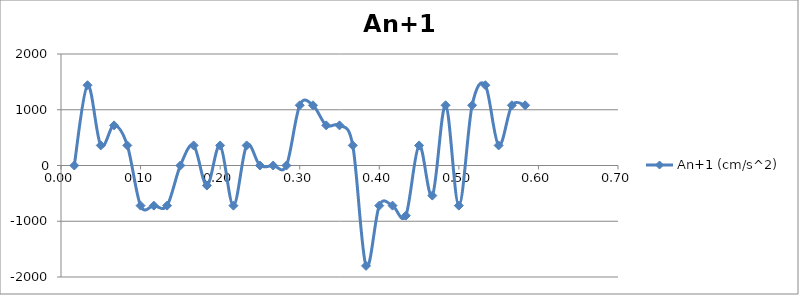
| Category | An+1 (cm/s^2) |
|---|---|
| 0.0166666666666667 | 0 |
| 0.0333333333333333 | 1440 |
| 0.05 | 360 |
| 0.0666666666666667 | 720 |
| 0.0833333333333333 | 360 |
| 0.1 | -720 |
| 0.116666666666667 | -720 |
| 0.133333333333333 | -720 |
| 0.15 | 0 |
| 0.166666666666667 | 360 |
| 0.183333333333333 | -360 |
| 0.2 | 360 |
| 0.216666666666667 | -720 |
| 0.233333333333333 | 360 |
| 0.25 | 0 |
| 0.266666666666667 | 0 |
| 0.283333333333333 | 0 |
| 0.3 | 108 |
| 0.316666666666667 | 1080 |
| 0.333333333333333 | 720 |
| 0.35 | 720 |
| 0.366666666666667 | 360 |
| 0.383333333333333 | -1800 |
| 0.4 | -720 |
| 0.416666666666667 | -720 |
| 0.433333333333333 | -900 |
| 0.45 | 360 |
| 0.466666666666667 | -540 |
| 0.483333333333333 | 1080 |
| 0.5 | -720 |
| 0.516666666666667 | 1080 |
| 0.533333333333333 | 1440 |
| 0.55 | 360 |
| 0.566666666666667 | 1080 |
| 0.583333333333333 | 1080 |